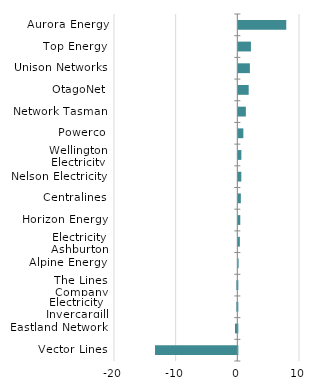
| Category | Series 0 |
|---|---|
| Aurora Energy | 7773490.664 |
| Top Energy | 2045663.76 |
| Unison Networks | 1875013.924 |
| OtagoNet | 1678358.366 |
| Network Tasman | 1221145.433 |
| Powerco | 813038.691 |
| Wellington Electricity | 490378.091 |
| Nelson Electricity | 482531.233 |
| Centralines | 407196.509 |
| Horizon Energy | 312685.705 |
| Electricity Ashburton | 246008.367 |
| Alpine Energy | 46361.374 |
| The Lines Company | -159871.082 |
| Electricity Invercargill | -160765.135 |
| Eastland Network | -382454.368 |
| Vector Lines | -13346450.774 |